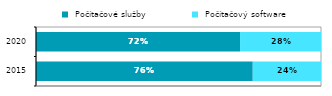
| Category |  Počítačové služby |  Počítačový software |
|---|---|---|
|  2015 | 0.761 | 0.239 |
|  2020 | 0.716 | 0.284 |